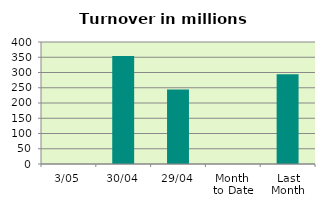
| Category | Series 0 |
|---|---|
| 3/05 | 0 |
| 30/04 | 354.503 |
| 29/04 | 244.173 |
| Month 
to Date | 0 |
| Last
Month | 294.539 |